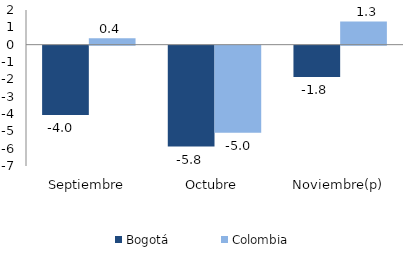
| Category | Bogotá | Colombia |
|---|---|---|
| Septiembre | -3.998 | 0.372 |
| Octubre | -5.821 | -5.024 |
| Noviembre(p) | -1.803 | 1.337 |